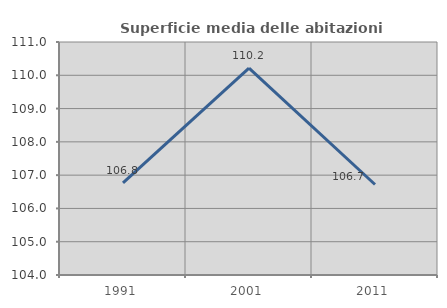
| Category | Superficie media delle abitazioni occupate |
|---|---|
| 1991.0 | 106.765 |
| 2001.0 | 110.215 |
| 2011.0 | 106.719 |